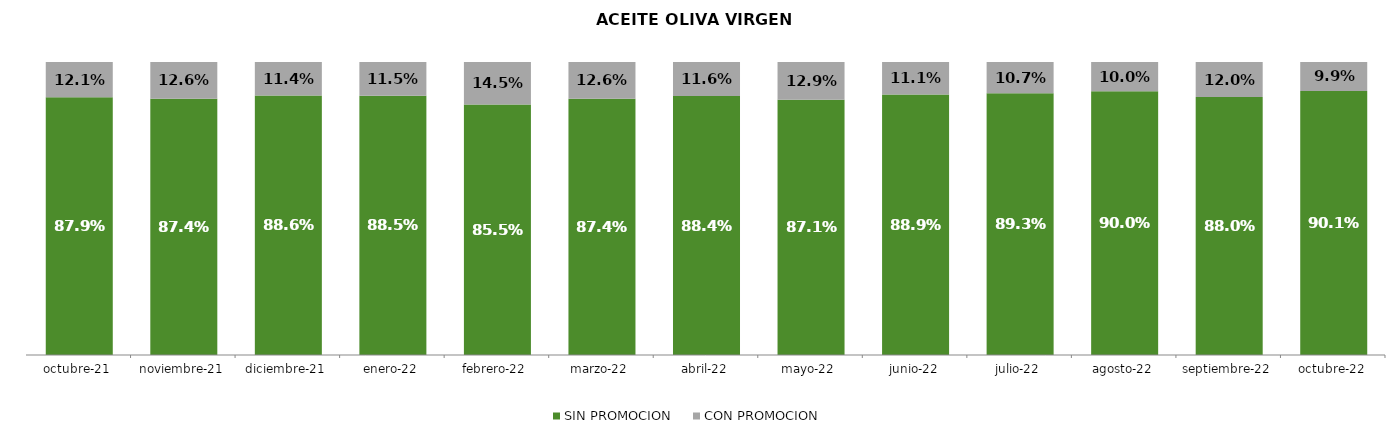
| Category | SIN PROMOCION   | CON PROMOCION   |
|---|---|---|
| 2021-10-01 | 0.879 | 0.121 |
| 2021-11-01 | 0.874 | 0.126 |
| 2021-12-01 | 0.886 | 0.114 |
| 2022-01-01 | 0.885 | 0.115 |
| 2022-02-01 | 0.855 | 0.145 |
| 2022-03-01 | 0.874 | 0.126 |
| 2022-04-01 | 0.884 | 0.116 |
| 2022-05-01 | 0.871 | 0.129 |
| 2022-06-01 | 0.889 | 0.111 |
| 2022-07-01 | 0.893 | 0.107 |
| 2022-08-01 | 0.9 | 0.1 |
| 2022-09-01 | 0.88 | 0.12 |
| 2022-10-01 | 0.901 | 0.099 |